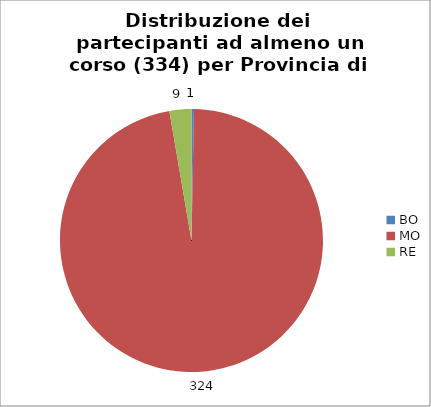
| Category | Nr. Tesserati |
|---|---|
| BO | 1 |
| MO | 324 |
| RE | 9 |